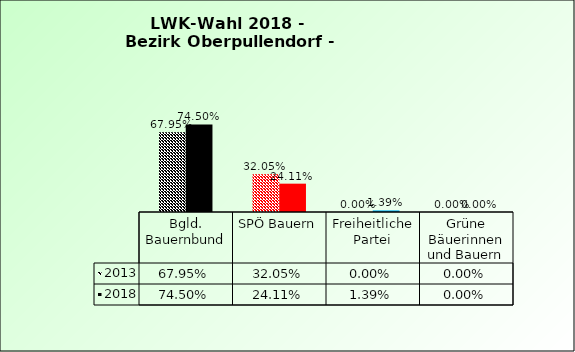
| Category | 2013 | 2018 |
|---|---|---|
| Bgld. Bauernbund | 0.679 | 0.745 |
| SPÖ Bauern | 0.321 | 0.241 |
| Freiheitliche Partei | 0 | 0.014 |
| Grüne Bäuerinnen und Bauern | 0 | 0 |